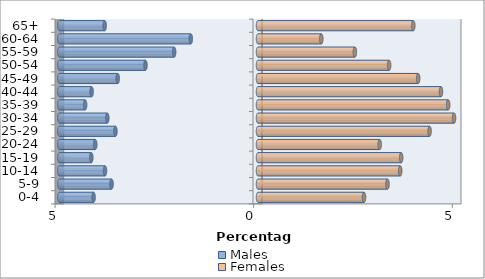
| Category | Males | Females |
|---|---|---|
| 0-4 | -4.138 | 2.668 |
| 5-9 | -3.686 | 3.259 |
| 10-14 | -3.851 | 3.58 |
| 15-19 | -4.195 | 3.604 |
| 20-24 | -4.097 | 3.062 |
| 25-29 | -3.588 | 4.319 |
| 30-34 | -3.793 | 4.934 |
| 35-39 | -4.351 | 4.787 |
| 40-44 | -4.187 | 4.606 |
| 45-49 | -3.53 | 4.031 |
| 50-54 | -2.833 | 3.3 |
| 55-59 | -2.11 | 2.438 |
| 60-64 | -1.691 | 1.593 |
| 65+ | -3.859 | 3.908 |